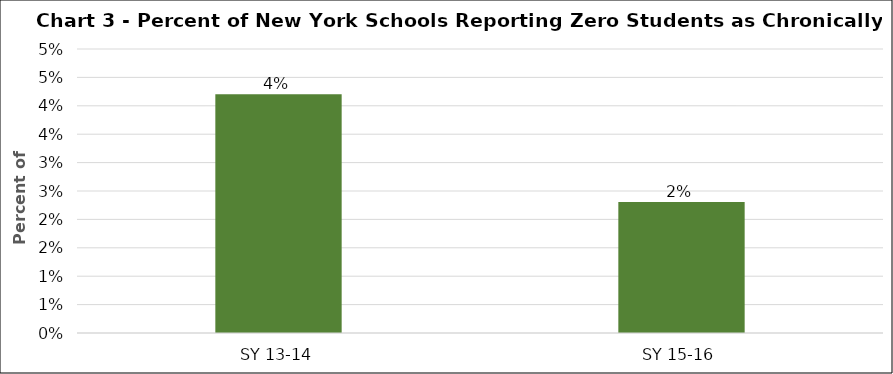
| Category | Series 0 |
|---|---|
| SY 13-14 | 0.042 |
| SY 15-16 | 0.023 |